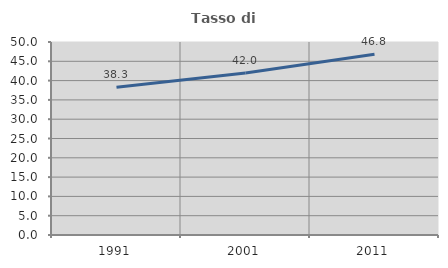
| Category | Tasso di occupazione   |
|---|---|
| 1991.0 | 38.257 |
| 2001.0 | 41.969 |
| 2011.0 | 46.822 |